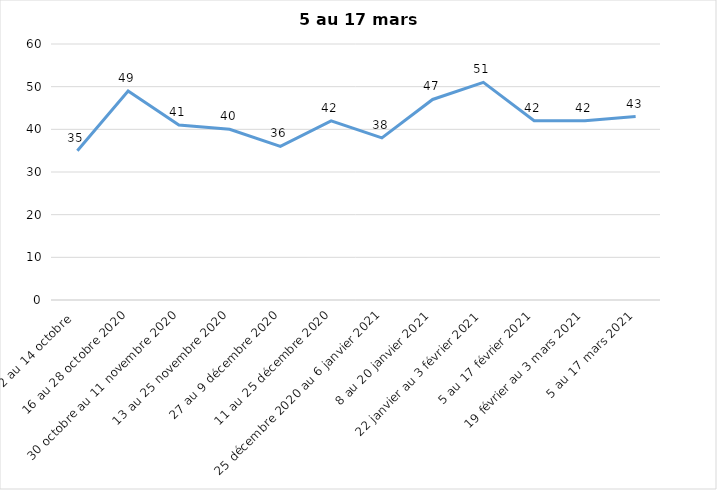
| Category | Toujours aux trois mesures |
|---|---|
| 2 au 14 octobre  | 35 |
| 16 au 28 octobre 2020 | 49 |
| 30 octobre au 11 novembre 2020 | 41 |
| 13 au 25 novembre 2020 | 40 |
| 27 au 9 décembre 2020 | 36 |
| 11 au 25 décembre 2020 | 42 |
| 25 décembre 2020 au 6 janvier 2021 | 38 |
| 8 au 20 janvier 2021 | 47 |
| 22 janvier au 3 février 2021 | 51 |
| 5 au 17 février 2021 | 42 |
| 19 février au 3 mars 2021 | 42 |
| 5 au 17 mars 2021 | 43 |